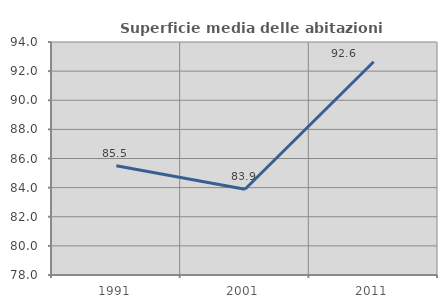
| Category | Superficie media delle abitazioni occupate |
|---|---|
| 1991.0 | 85.508 |
| 2001.0 | 83.891 |
| 2011.0 | 92.644 |